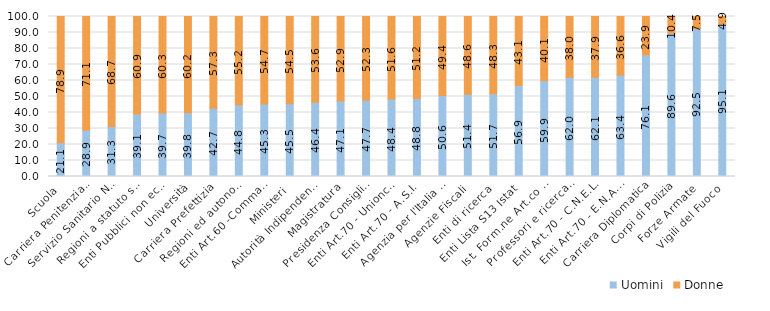
| Category | Uomini | Donne |
|---|---|---|
| Scuola | 21.082 | 78.918 |
| Carriera Penitenziaria | 28.916 | 71.084 |
| Servizio Sanitario Naz. | 31.273 | 68.727 |
| Regioni a statuto speciale e Prov. aut. | 39.088 | 60.912 |
| Enti Pubblici non economici | 39.651 | 60.349 |
| Università | 39.785 | 60.215 |
| Carriera Prefettizia | 42.709 | 57.291 |
| Regioni ed autonomie locali | 44.842 | 55.158 |
| Enti Art.60 -Comma 3- D.165/01 | 45.313 | 54.687 |
| Ministeri | 45.494 | 54.506 |
| Autorità Indipendenti | 46.427 | 53.573 |
| Magistratura | 47.133 | 52.867 |
| Presidenza Consiglio Ministri | 47.671 | 52.329 |
| Enti Art.70 - Unioncamere | 48.387 | 51.613 |
| Enti Art.70 - A.S.I. | 48.772 | 51.228 |
| Agenzia per l'Italia digitale | 50.617 | 49.383 |
| Agenzie Fiscali | 51.399 | 48.601 |
| Enti di ricerca | 51.708 | 48.292 |
| Enti Lista S13 Istat | 56.913 | 43.087 |
| Ist. Form.ne Art.co Mus.le | 59.873 | 40.127 |
| Professori e ricercatori universitari | 62.037 | 37.963 |
| Enti Art.70 - C.N.E.L. | 62.069 | 37.931 |
| Enti Art.70 - E.N.A.C. | 63.4 | 36.6 |
| Carriera Diplomatica | 76.083 | 23.917 |
| Corpi di Polizia | 89.582 | 10.418 |
| Forze Armate | 92.453 | 7.547 |
| Vigili del Fuoco | 95.101 | 4.899 |